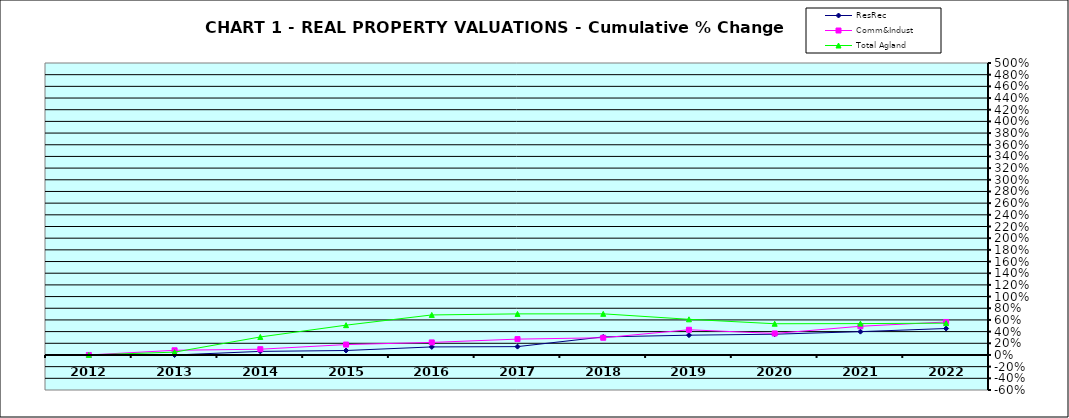
| Category | ResRec | Comm&Indust | Total Agland |
|---|---|---|---|
| 2012.0 | 0 | 0 | 0 |
| 2013.0 | -0.001 | 0.08 | 0.049 |
| 2014.0 | 0.061 | 0.098 | 0.308 |
| 2015.0 | 0.076 | 0.178 | 0.51 |
| 2016.0 | 0.138 | 0.215 | 0.685 |
| 2017.0 | 0.143 | 0.271 | 0.703 |
| 2018.0 | 0.309 | 0.295 | 0.704 |
| 2019.0 | 0.339 | 0.432 | 0.611 |
| 2020.0 | 0.355 | 0.368 | 0.535 |
| 2021.0 | 0.399 | 0.492 | 0.537 |
| 2022.0 | 0.453 | 0.565 | 0.544 |